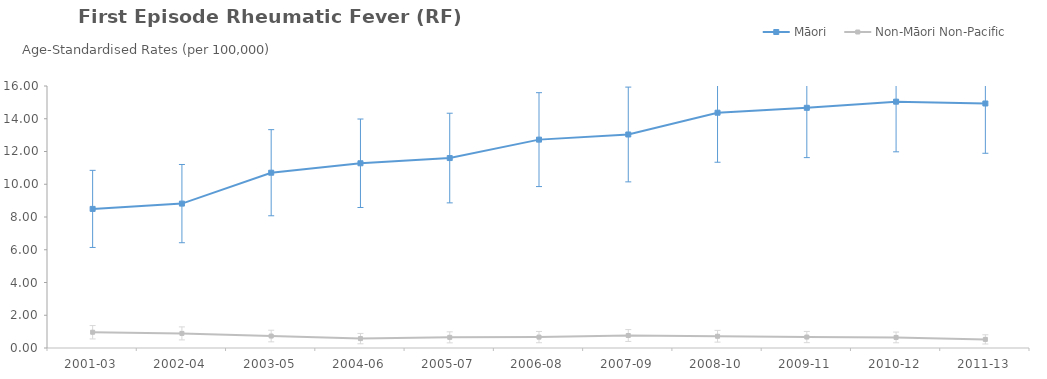
| Category | Māori | Non-Māori Non-Pacific |
|---|---|---|
| 2001-03 | 8.494 | 0.963 |
| 2002-04 | 8.818 | 0.891 |
| 2003-05 | 10.705 | 0.731 |
| 2004-06 | 11.281 | 0.574 |
| 2005-07 | 11.6 | 0.651 |
| 2006-08 | 12.725 | 0.665 |
| 2007-09 | 13.039 | 0.763 |
| 2008-10 | 14.369 | 0.717 |
| 2009-11 | 14.668 | 0.67 |
| 2010-12 | 15.044 | 0.646 |
| 2011-13 | 14.932 | 0.526 |